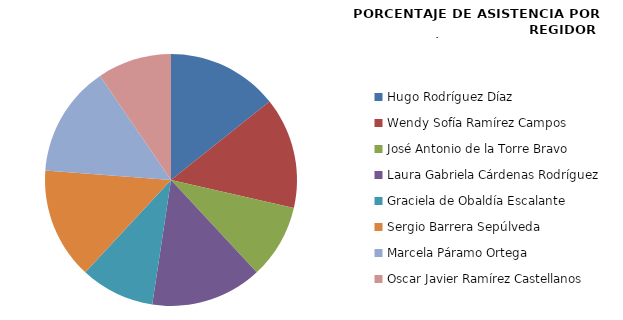
| Category | Series 0 |
|---|---|
| Hugo Rodríguez Díaz  | 100 |
| Wendy Sofía Ramírez Campos | 100 |
| José Antonio de la Torre Bravo | 66.667 |
| Laura Gabriela Cárdenas Rodríguez | 100 |
| Graciela de Obaldía Escalante | 66.667 |
| Sergio Barrera Sepúlveda | 100 |
| Marcela Páramo Ortega | 100 |
| Oscar Javier Ramírez Castellanos | 66.667 |